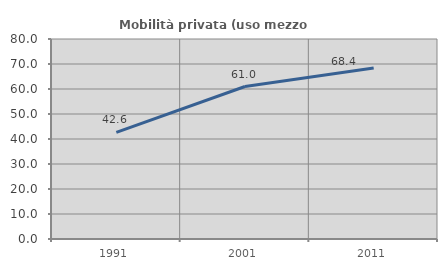
| Category | Mobilità privata (uso mezzo privato) |
|---|---|
| 1991.0 | 42.648 |
| 2001.0 | 60.997 |
| 2011.0 | 68.375 |